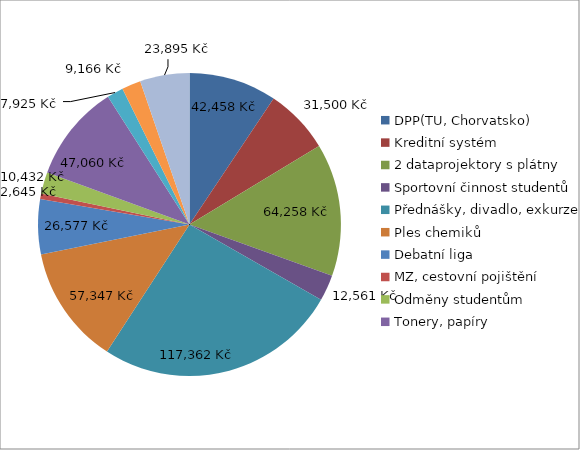
| Category | Series 0 |
|---|---|
| DPP(TU, Chorvatsko) | 42458 |
| Kreditní systém | 31500 |
| 2 dataprojektory s plátny | 64258 |
| Sportovní činnost studentů | 12561 |
| Přednášky, divadlo, exkurze  | 117362 |
| Ples chemiků  | 57347 |
| Debatní liga | 26577 |
| MZ, cestovní pojištění | 2645 |
| Odměny studentům | 10432 |
| Tonery, papíry  | 47060 |
| Stravné akce školy | 7925 |
| Den přírodních věd | 9166 |
| Soutěže | 23895 |